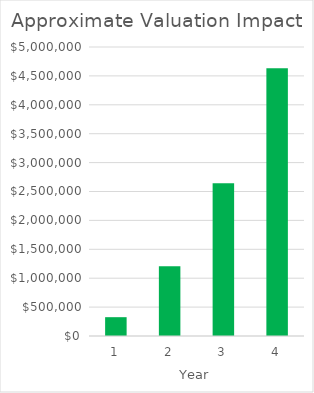
| Category | Series 1 |
|---|---|
| 0 | 325588.24 |
| 1 | 1206266.323 |
| 2 | 2642444.406 |
| 3 | 4634122.49 |